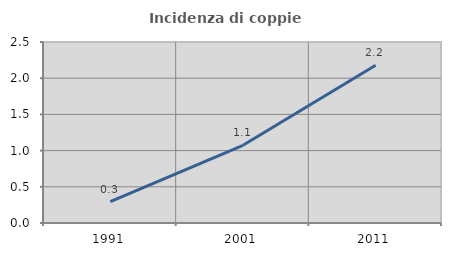
| Category | Incidenza di coppie miste |
|---|---|
| 1991.0 | 0.296 |
| 2001.0 | 1.073 |
| 2011.0 | 2.179 |